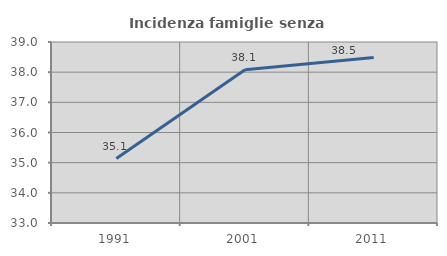
| Category | Incidenza famiglie senza nuclei |
|---|---|
| 1991.0 | 35.135 |
| 2001.0 | 38.08 |
| 2011.0 | 38.485 |